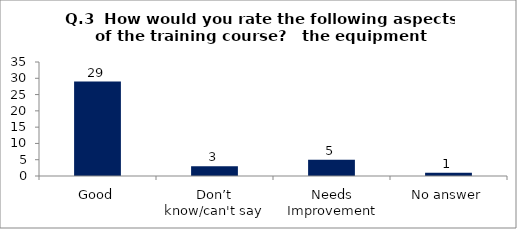
| Category | Q.3  How would you rate the following aspects of the training course?  |
|---|---|
| Good | 29 |
| Don’t know/can't say | 3 |
| Needs Improvement | 5 |
| No answer | 1 |